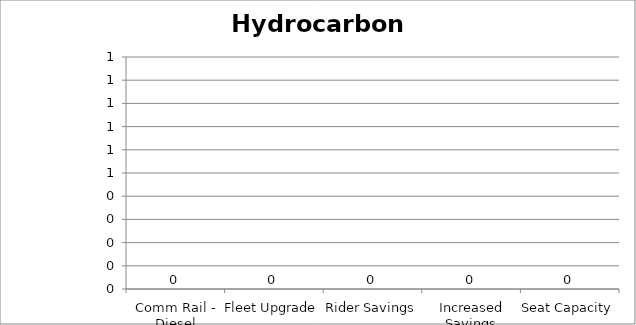
| Category | Hydrocarbons |
|---|---|
| Comm Rail - Diesel | 0 |
| Fleet Upgrade | 0 |
| Rider Savings | 0 |
| Increased Savings | 0 |
| Seat Capacity | 0 |